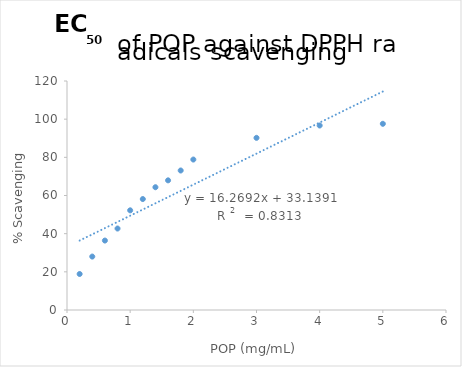
| Category | Series 0 |
|---|---|
| 0.2 | 18.867 |
| 0.4 | 28 |
| 0.6 | 36.39 |
| 0.8 | 42.693 |
| 1.0 | 52.23 |
| 1.2 | 58.14 |
| 1.4 | 64.337 |
| 1.6 | 67.94 |
| 1.8 | 73.1 |
| 2.0 | 78.843 |
| 3.0 | 90.21 |
| 4.0 | 96.677 |
| 5.0 | 97.573 |